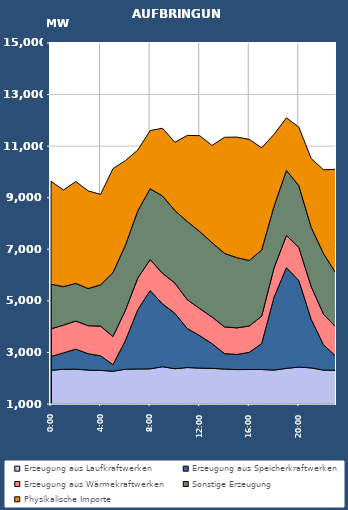
| Category | Erzeugung aus Laufkraftwerken | Erzeugung aus Speicherkraftwerken | Erzeugung aus Wärmekraftwerken | Sonstige Erzeugung | Physikalische Importe |
|---|---|---|---|---|---|
| 2007-01-17 | 2307.248 | 536.84 | 1072.699 | 1729.118 | 3994.655 |
| 2007-01-17 01:00:00 | 2347.299 | 633.927 | 1078.346 | 1491.379 | 3748.399 |
| 2007-01-17 02:00:00 | 2350.54 | 777.764 | 1088.234 | 1461.3 | 3947.975 |
| 2007-01-17 03:00:00 | 2316.06 | 634.332 | 1085.082 | 1441.569 | 3789.399 |
| 2007-01-17 04:00:00 | 2303.899 | 567.038 | 1149.816 | 1600.113 | 3508.123 |
| 2007-01-17 05:00:00 | 2270.577 | 256 | 1088.789 | 2482.124 | 4028.567 |
| 2007-01-17 06:00:00 | 2348.731 | 1106.186 | 1174.139 | 2524.977 | 3283.819 |
| 2007-01-17 07:00:00 | 2357.97 | 2299.573 | 1224.733 | 2604.43 | 2361.299 |
| 2007-01-17 08:00:00 | 2362.909 | 3036.703 | 1198.355 | 2749.672 | 2256.079 |
| 2007-01-17 09:00:00 | 2445.347 | 2437.689 | 1186.03 | 2999.568 | 2627.111 |
| 2007-01-17 10:00:00 | 2367.776 | 2148.374 | 1173.172 | 2813.938 | 2646.151 |
| 2007-01-17 11:00:00 | 2414.616 | 1513.836 | 1114.937 | 3033.143 | 3341.687 |
| 2007-01-17 12:00:00 | 2392.271 | 1260.338 | 1049.615 | 2987.794 | 3715.036 |
| 2007-01-17 13:00:00 | 2382.814 | 957.99 | 1031.119 | 2883.924 | 3771.172 |
| 2007-01-17 14:00:00 | 2354.439 | 600.673 | 1036.881 | 2850.732 | 4500.494 |
| 2007-01-17 15:00:00 | 2334.372 | 587.126 | 1030.215 | 2722.82 | 4676.826 |
| 2007-01-17 16:00:00 | 2337.409 | 666.541 | 1021.747 | 2540.88 | 4696.843 |
| 2007-01-17 17:00:00 | 2337.632 | 1006.567 | 1060.361 | 2566.4 | 3962.423 |
| 2007-01-17 18:00:00 | 2316.386 | 2827.872 | 1134.502 | 2393.499 | 2788.015 |
| 2007-01-17 19:00:00 | 2381.327 | 3906.93 | 1246.506 | 2521.522 | 2041.071 |
| 2007-01-17 20:00:00 | 2431.293 | 3357.271 | 1284.744 | 2396.43 | 2269.971 |
| 2007-01-17 21:00:00 | 2399.392 | 1884.528 | 1269.657 | 2297.947 | 2668.331 |
| 2007-01-17 22:00:00 | 2313.85 | 975.083 | 1188.463 | 2350.031 | 3254.511 |
| 2007-01-17 23:00:00 | 2304.682 | 547.773 | 1127.148 | 2088.33 | 4036.935 |